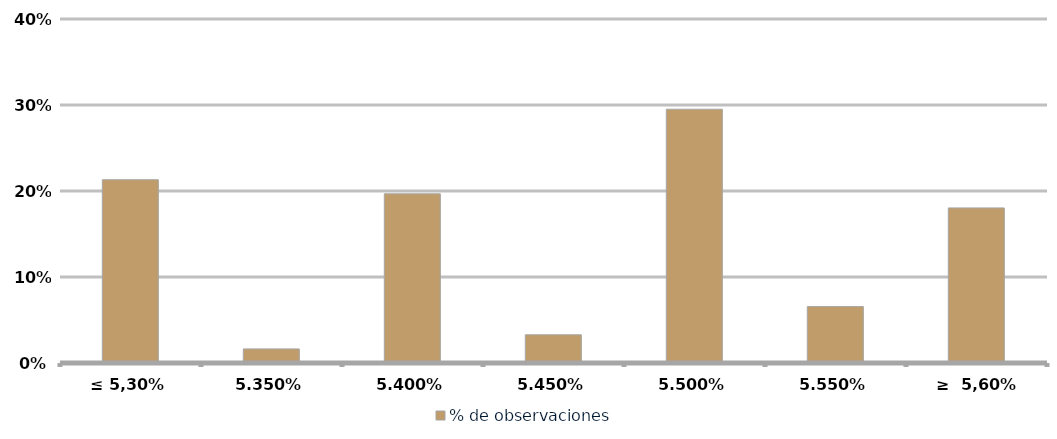
| Category | % de observaciones  |
|---|---|
| ≤ 5,30% | 0.213 |
| 5.35% | 0.016 |
| 5.40% | 0.197 |
| 5.45% | 0.033 |
| 5.50% | 0.295 |
| 5.55% | 0.066 |
| ≥  5,60% | 0.18 |